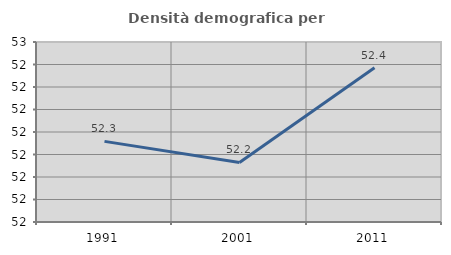
| Category | Densità demografica |
|---|---|
| 1991.0 | 52.279 |
| 2001.0 | 52.232 |
| 2011.0 | 52.443 |